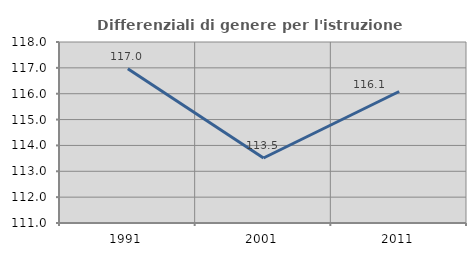
| Category | Differenziali di genere per l'istruzione superiore |
|---|---|
| 1991.0 | 116.965 |
| 2001.0 | 113.514 |
| 2011.0 | 116.086 |